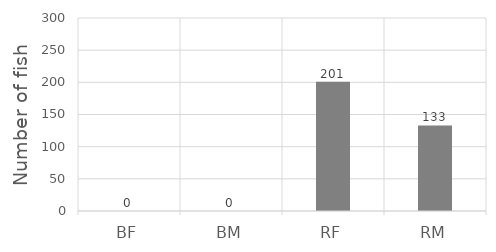
| Category | Series 0 |
|---|---|
| BF | 0 |
| BM | 0 |
| RF | 201 |
| RM | 133 |